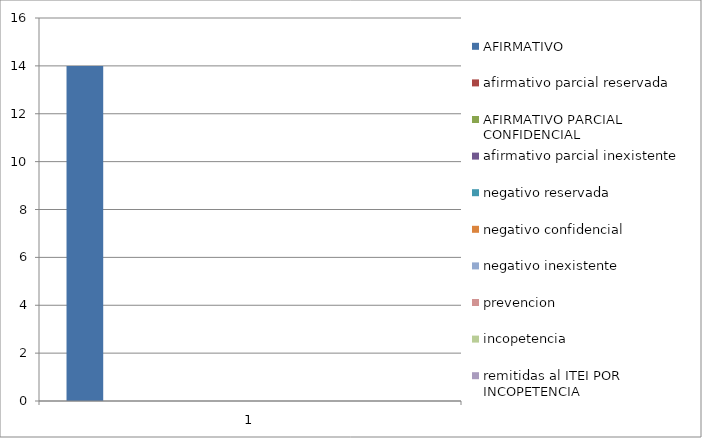
| Category | AFIRMATIVO  | afirmativo parcial reservada | AFIRMATIVO PARCIAL CONFIDENCIAL | afirmativo parcial inexistente  | negativo reservada | negativo confidencial | negativo inexistente  | prevencion | incopetencia | remitidas al ITEI POR INCOPETENCIA  |
|---|---|---|---|---|---|---|---|---|---|---|
| 0 | 14 |  | 0 | 0 | 0 | 0 | 0 | 0 | 0 | 0 |